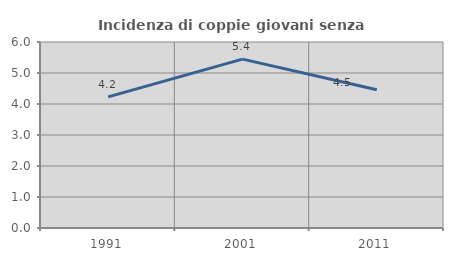
| Category | Incidenza di coppie giovani senza figli |
|---|---|
| 1991.0 | 4.231 |
| 2001.0 | 5.447 |
| 2011.0 | 4.461 |